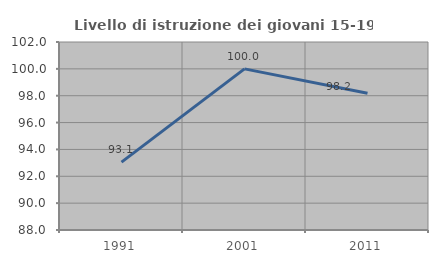
| Category | Livello di istruzione dei giovani 15-19 anni |
|---|---|
| 1991.0 | 93.056 |
| 2001.0 | 100 |
| 2011.0 | 98.182 |